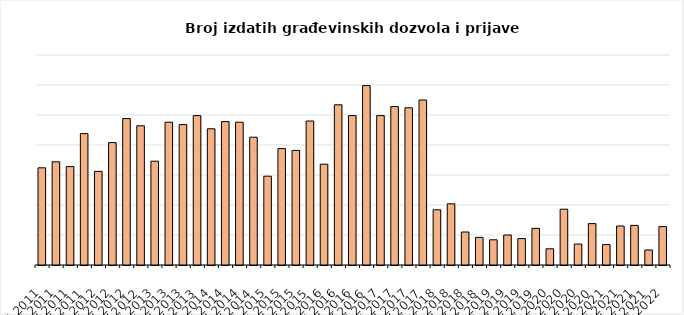
| Category | Broj izdatih građevinskih dozvola i prijava radova |
|---|---|
| I 2011 | 162 |
| II 2011 | 172 |
| III 2011 | 164 |
| IV 2011 | 219 |
| I 2012 | 156 |
| II 2012 | 204 |
| III 2012 | 244 |
| IV 2012 | 232 |
| I 2013 | 173 |
| II 2013 | 238 |
| III 2013 | 234 |
| IV 2013 | 249 |
| I 2014 | 227 |
| II 2014 | 239 |
| III 2014 | 238 |
| IV 2014 | 213 |
| I 2015 | 148 |
| II 2015 | 194 |
| III 2015 | 191 |
| IV 2015 | 240 |
| I 2016 | 168 |
| II 2016 | 267 |
| III 2016 | 249 |
| IV 2016 | 299 |
| I 2017 | 249 |
| II 2017 | 264 |
| III 2017 | 262 |
| IV 2017 | 275 |
| I 2018 | 92 |
| II 2018 | 102 |
| III 2018 | 55 |
| IV 2018 | 46 |
| I 2019 | 42 |
| II 2019 | 50 |
| III 2019 | 44 |
| IV 2019 | 61 |
| I 2020 | 27 |
| II 2020 | 93 |
| III 2020 | 35 |
| IV 2020 | 69 |
| I 2021 | 34 |
| II 2021 | 65 |
| III 2021 | 66 |
| IV 2021 | 25 |
| I 2022 | 64 |